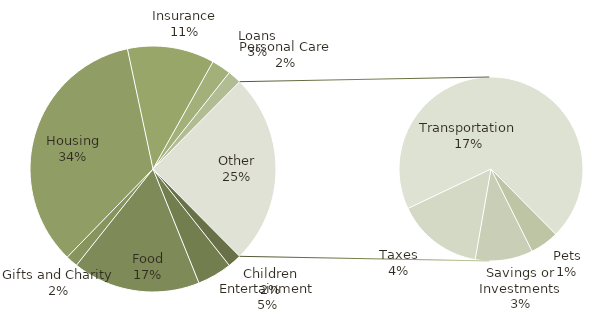
| Category | Total |
|---|---|
| Children | 140 |
| Entertainment | 358 |
| Food | 1320 |
| Gifts and Charity | 125 |
| Housing | 2702 |
| Insurance | 900 |
| Loans | 200 |
| Personal Care | 140 |
| Pets | 100 |
| Savings or Investments | 200 |
| Taxes | 300 |
| Transportation | 1375 |